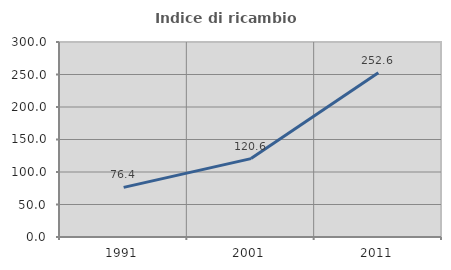
| Category | Indice di ricambio occupazionale  |
|---|---|
| 1991.0 | 76.402 |
| 2001.0 | 120.617 |
| 2011.0 | 252.567 |